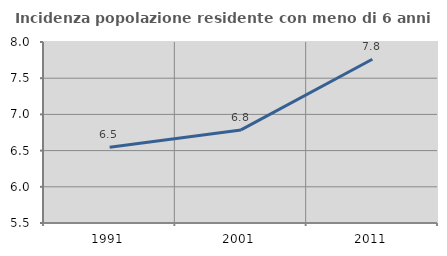
| Category | Incidenza popolazione residente con meno di 6 anni |
|---|---|
| 1991.0 | 6.546 |
| 2001.0 | 6.786 |
| 2011.0 | 7.761 |